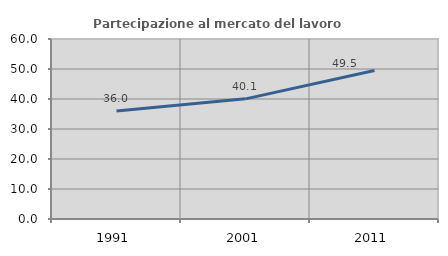
| Category | Partecipazione al mercato del lavoro  femminile |
|---|---|
| 1991.0 | 35.992 |
| 2001.0 | 40.051 |
| 2011.0 | 49.486 |